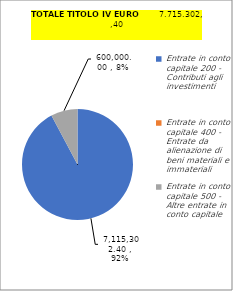
| Category | Series 1 | Series 0 |
|---|---|---|
| 0 | 7115302.4 | 14090038.98 |
| 1 | 0 | 4492996 |
| 2 | 600000 | 600000 |